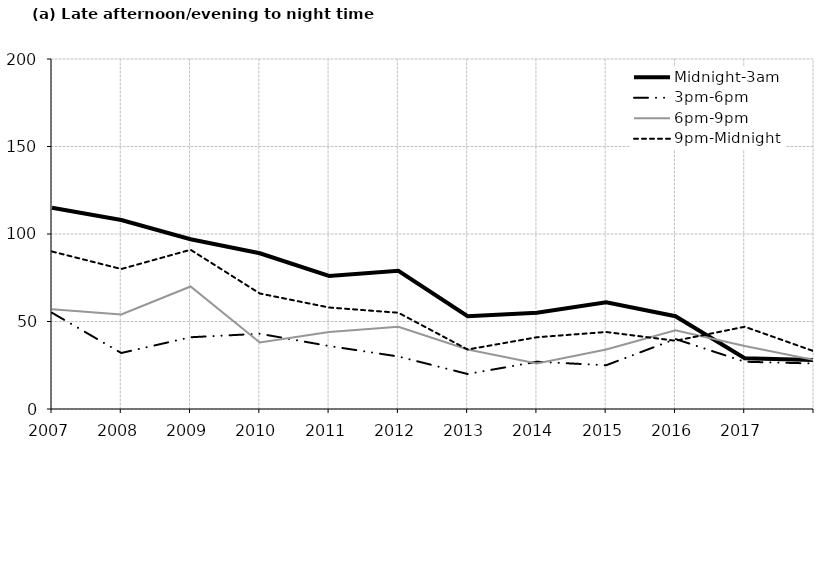
| Category | Midnight-3am | 3pm-6pm | 6pm-9pm | 9pm-Midnight |
|---|---|---|---|---|
| 2007.0 | 115 | 55 | 57 | 90 |
| 2008.0 | 108 | 32 | 54 | 80 |
| 2009.0 | 97 | 41 | 70 | 91 |
| 2010.0 | 89 | 43 | 38 | 66 |
| 2011.0 | 76 | 36 | 44 | 58 |
| 2012.0 | 79 | 30 | 47 | 55 |
| 2013.0 | 53 | 20 | 34 | 34 |
| 2014.0 | 55 | 27 | 26 | 41 |
| 2015.0 | 61 | 25 | 34 | 44 |
| 2016.0 | 53 | 40 | 45 | 39 |
| 2017.0 | 29 | 27 | 36 | 47 |